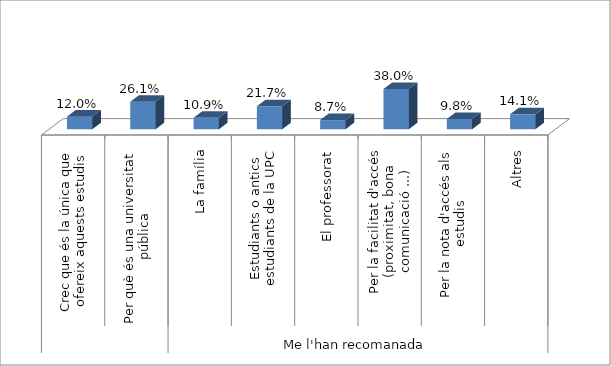
| Category | Grau en Estudis d'Arquitectura |
|---|---|
| 0 | 0.12 |
| 1 | 0.261 |
| 2 | 0.109 |
| 3 | 0.217 |
| 4 | 0.087 |
| 5 | 0.38 |
| 6 | 0.098 |
| 7 | 0.141 |